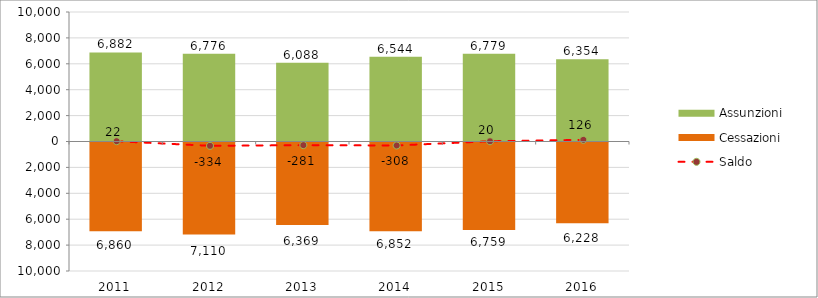
| Category | Assunzioni | Cessazioni |
|---|---|---|
| 2011.0 | 6882 | -6860 |
| 2012.0 | 6776 | -7110 |
| 2013.0 | 6088 | -6369 |
| 2014.0 | 6544 | -6852 |
| 2015.0 | 6779 | -6759 |
| 2016.0 | 6354 | -6228 |